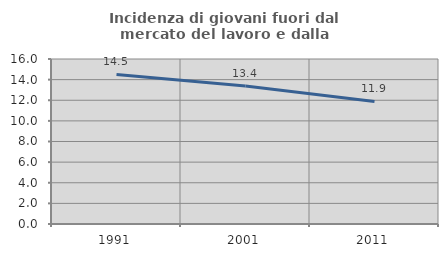
| Category | Incidenza di giovani fuori dal mercato del lavoro e dalla formazione  |
|---|---|
| 1991.0 | 14.505 |
| 2001.0 | 13.388 |
| 2011.0 | 11.886 |